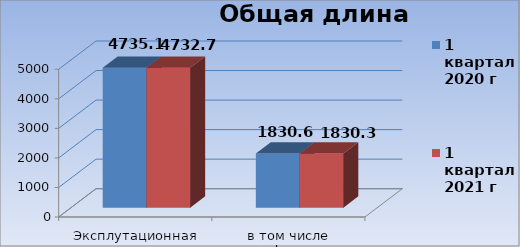
| Category | 1 квартал
2020 г | 1 квартал
2021 г |
|---|---|---|
| Эксплутационная длина железных дорог, км | 4735.1 | 4732.7 |
| в том числе электрифицированных дорог, км  | 1830.6 | 1830.3 |